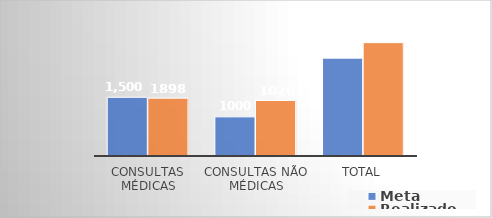
| Category | Meta | Realizado |
|---|---|---|
| Consultas Médicas | 1500 | 1478 |
| Consultas não médicas | 1000 | 1418 |
| Total | 2500 | 2896 |